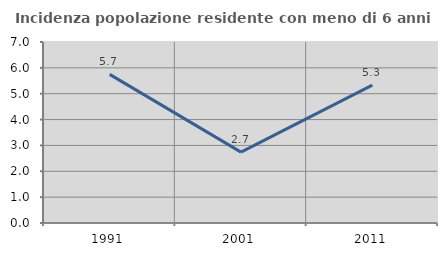
| Category | Incidenza popolazione residente con meno di 6 anni |
|---|---|
| 1991.0 | 5.747 |
| 2001.0 | 2.74 |
| 2011.0 | 5.333 |